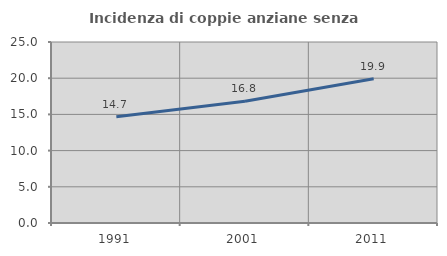
| Category | Incidenza di coppie anziane senza figli  |
|---|---|
| 1991.0 | 14.684 |
| 2001.0 | 16.812 |
| 2011.0 | 19.936 |